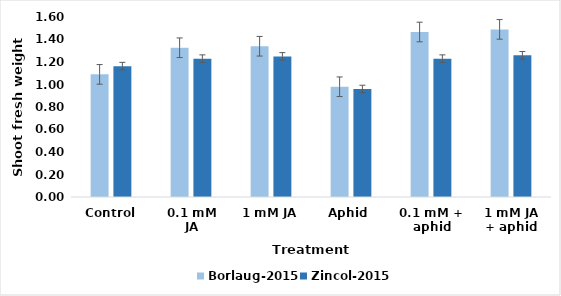
| Category | Borlaug-2015 | Zincol-2015 |
|---|---|---|
| Control | 1.09 | 1.163 |
| 0.1 mM JA | 1.327 | 1.23 |
| 1 mM JA | 1.34 | 1.25 |
| Aphid  | 0.98 | 0.96 |
| 0.1 mM + aphid | 1.467 | 1.23 |
| 1 mM JA + aphid | 1.49 | 1.26 |